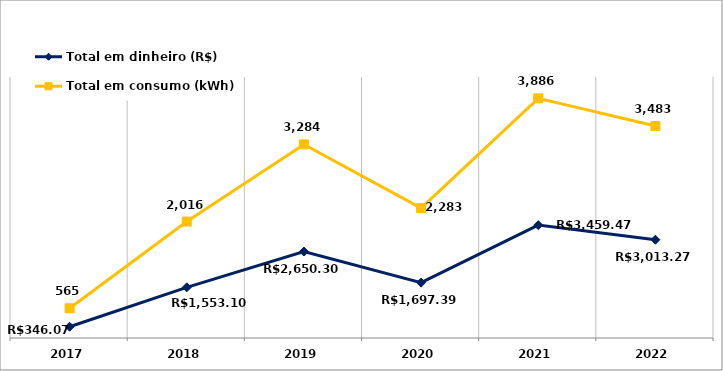
| Category | Total em dinheiro (R$) | Total em consumo (kWh) |
|---|---|---|
| 2017.0 | 346.07 | 565 |
| 2018.0 | 1553.1 | 2016 |
| 2019.0 | 2650.3 | 3284 |
| 2020.0 | 1697.39 | 2283 |
| 2021.0 | 3459.47 | 3886 |
| 2022.0 | 3013.27 | 3483 |